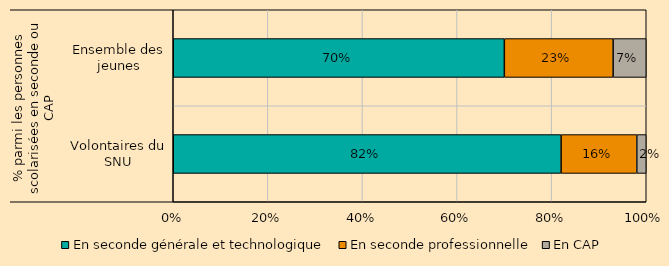
| Category | En seconde générale et technologique | En seconde professionnelle | En CAP |
|---|---|---|---|
| 0 | 0.82 | 0.16 | 0.02 |
| 1 | 0.7 | 0.23 | 0.07 |